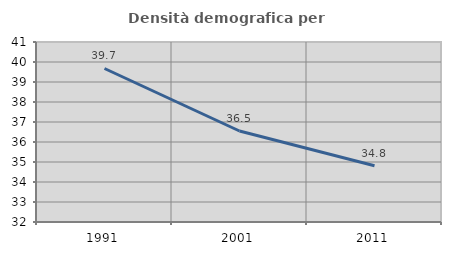
| Category | Densità demografica |
|---|---|
| 1991.0 | 39.675 |
| 2001.0 | 36.55 |
| 2011.0 | 34.814 |